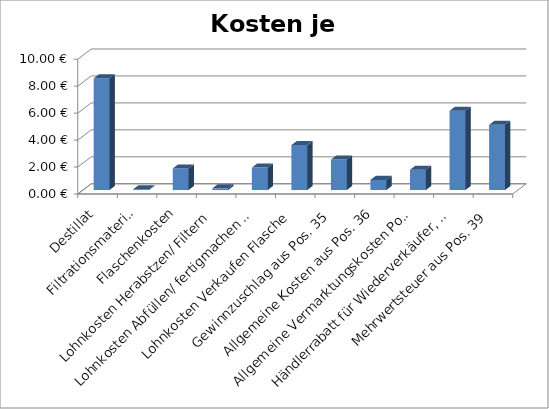
| Category | Kosten je Flasche |
|---|---|
| Destillat | 8.291 |
| Filtrationsmaterial | 0.06 |
| Flaschenkosten | 1.6 |
| Lohnkosten Herabstzen/ Filtern | 0.128 |
| Lohnkosten Abfüllen/ fertigmachen Flasche | 1.667 |
| Lohnkosten Verkaufen Flasche | 3.333 |
| Gewinnzuschlag aus Pos. 35 | 2.262 |
| Allgemeine Kosten aus Pos. 36 | 0.754 |
| Allgemeine Vermarktungskosten Pos. 37 | 1.508 |
| Händlerrabatt für Wiederverkäufer, Handelsvertreter Pos. 38 | 5.881 |
| Mehrwertsteuer aus Pos. 39 | 4.842 |